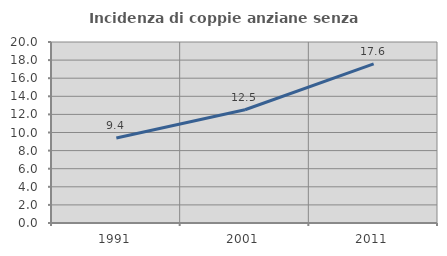
| Category | Incidenza di coppie anziane senza figli  |
|---|---|
| 1991.0 | 9.394 |
| 2001.0 | 12.515 |
| 2011.0 | 17.58 |